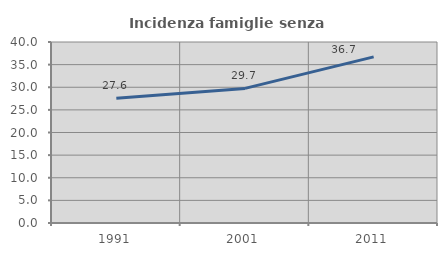
| Category | Incidenza famiglie senza nuclei |
|---|---|
| 1991.0 | 27.561 |
| 2001.0 | 29.747 |
| 2011.0 | 36.71 |